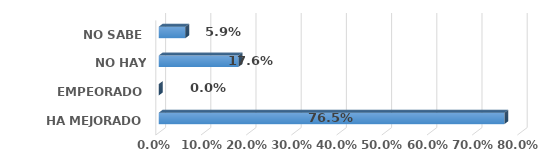
| Category | Series 0 |
|---|---|
| HA MEJORADO | 0.765 |
| EMPEORADO | 0 |
| NO HAY DIFERENCIA | 0.176 |
| NO SABE | 0.059 |